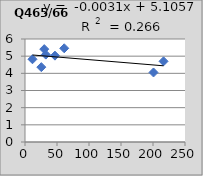
| Category | Q465/665 |
|---|---|
| 25.5 | 4.36 |
| 61.3 | 5.46 |
| 11.7 | 4.82 |
| 216.5 | 4.7 |
| 46.8 | 5.03 |
| 32.5 | 5.09 |
| 200.8 | 4.05 |
| 30.1 | 5.41 |